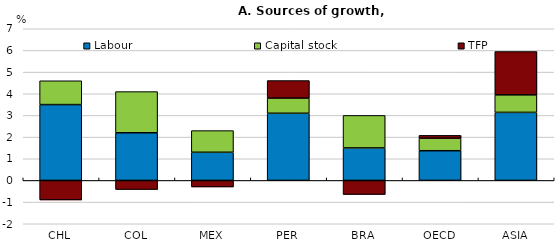
| Category | Labour | Capital stock | TFP |
|---|---|---|---|
| CHL | 3.5 | 1.1 | -0.9 |
| COL | 2.2 | 1.9 | -0.42 |
| MEX | 1.3 | 1 | -0.3 |
| PER | 3.1 | 0.7 | 0.81 |
| BRA | 1.5 | 1.5 | -0.65 |
| OECD | 1.37 | 0.58 | 0.13 |
| ASIA | 3.14 | 0.81 | 2 |